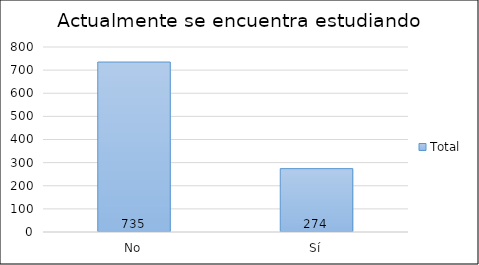
| Category | Total |
|---|---|
| No | 735 |
| Sí | 274 |